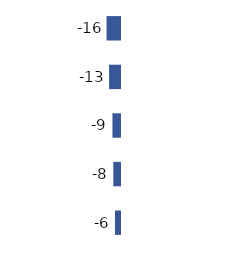
| Category | Series 0 |
|---|---|
| 0 | -16 |
| 1 | -13 |
| 2 | -9 |
| 3 | -8 |
| 4 | -6 |